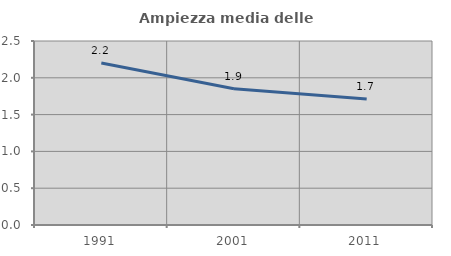
| Category | Ampiezza media delle famiglie |
|---|---|
| 1991.0 | 2.202 |
| 2001.0 | 1.852 |
| 2011.0 | 1.711 |